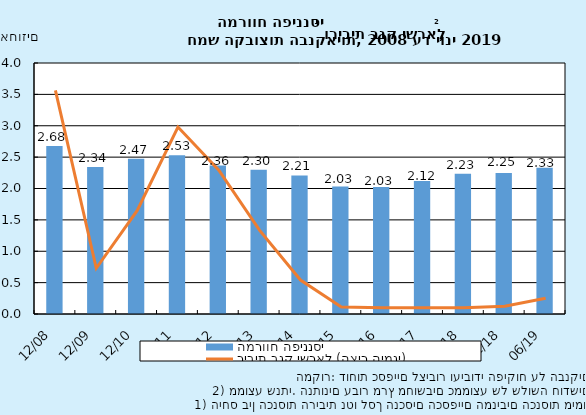
| Category | המרווח הפיננסי |
|---|---|
| 2008-12-31 | 2.677 |
| 2009-12-31 | 2.343 |
| 2010-12-31 | 2.475 |
| 2011-12-31 | 2.53 |
| 2012-12-31 | 2.365 |
| 2013-12-31 | 2.3 |
| 2014-12-31 | 2.209 |
| 2015-12-31 | 2.033 |
| 2016-12-31 | 2.025 |
| 2017-12-31 | 2.118 |
| 2018-06-30 | 2.233 |
| 2018-12-31 | 2.247 |
| 2019-06-30 | 2.329 |